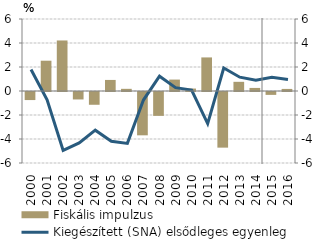
| Category | Fiskális impulzus |
|---|---|
| 0 | -0.672 |
| 1900-01-01 | 2.524 |
| 1900-01-02 | 4.211 |
| 1900-01-03 | -0.622 |
| 1900-01-04 | -1.064 |
| 1900-01-05 | 0.922 |
| 1900-01-06 | 0.18 |
| 1900-01-07 | -3.61 |
| 1900-01-08 | -1.989 |
| 1900-01-09 | 0.952 |
| 1900-01-10 | 0.204 |
| 1900-01-11 | 2.798 |
| 1900-01-12 | -4.637 |
| 1900-01-13 | 0.765 |
| 1900-01-14 | 0.256 |
| 1900-01-15 | -0.24 |
| 1900-01-16 | 0.173 |